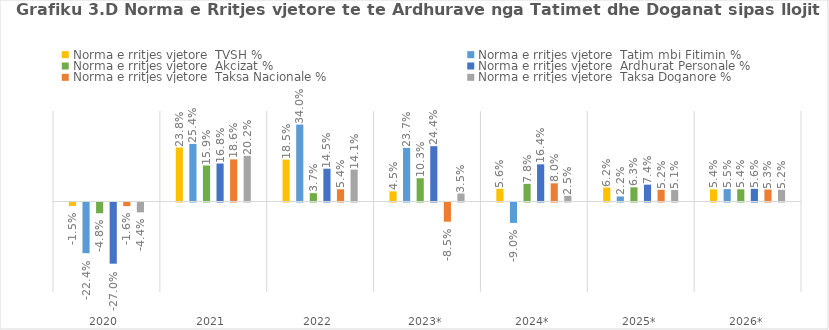
| Category | Norma e rritjes vjetore  TVSH %  | Norma e rritjes vjetore  Tatim mbi Fitimin %  | Norma e rritjes vjetore  Akcizat %  | Norma e rritjes vjetore  Ardhurat Personale %  | Norma e rritjes vjetore  Taksa Nacionale %  | Norma e rritjes vjetore  Taksa Doganore %  |
|---|---|---|---|---|---|---|
| 2020  | -0.015 | -0.224 | -0.048 | -0.27 | -0.016 | -0.044 |
| 2021  | 0.238 | 0.254 | 0.159 | 0.168 | 0.186 | 0.202 |
| 2022  | 0.185 | 0.34 | 0.037 | 0.145 | 0.054 | 0.141 |
| 2023* | 0.045 | 0.237 | 0.103 | 0.244 | -0.085 | 0.035 |
| 2024* | 0.056 | -0.09 | 0.078 | 0.164 | 0.08 | 0.025 |
| 2025* | 0.062 | 0.022 | 0.063 | 0.074 | 0.052 | 0.051 |
| 2026* | 0.054 | 0.055 | 0.054 | 0.056 | 0.053 | 0.052 |